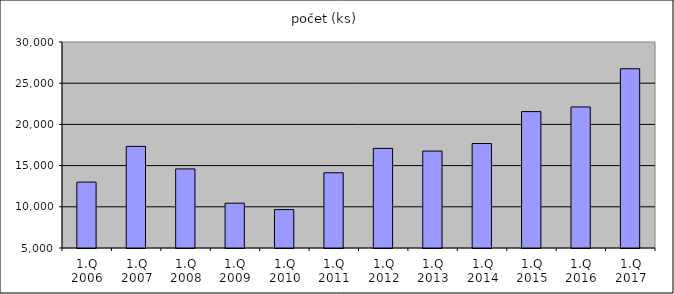
| Category | počet (ks) |
|---|---|
| 1.Q 2006 | 12996 |
| 1.Q 2007 | 17330 |
| 1.Q 2008 | 14597 |
| 1.Q 2009 | 10440 |
| 1.Q 2010 | 9662 |
| 1.Q 2011 | 14133 |
| 1.Q 2012 | 17090 |
| 1.Q 2013 | 16759 |
| 1.Q 2014 | 17680 |
| 1.Q 2015 | 21554 |
| 1.Q 2016 | 22119 |
| 1.Q 2017 | 26752 |